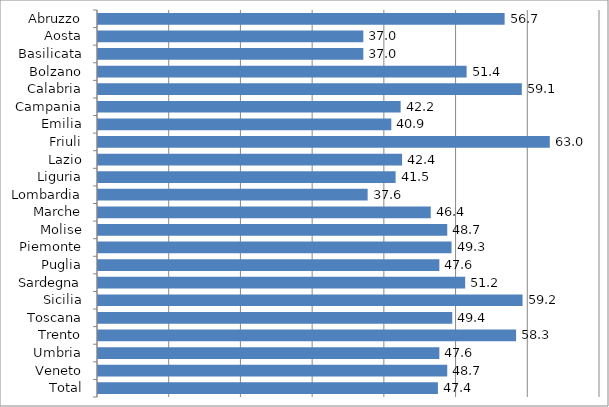
| Category | Series 0 |
|---|---|
| Abruzzo | 56.7 |
| Aosta | 37 |
| Basilicata | 37 |
| Bolzano | 51.4 |
| Calabria | 59.1 |
| Campania | 42.2 |
| Emilia | 40.9 |
| Friuli | 63 |
| Lazio | 42.4 |
| Liguria | 41.5 |
| Lombardia | 37.6 |
| Marche | 46.4 |
| Molise | 48.7 |
| Piemonte | 49.3 |
| Puglia | 47.6 |
| Sardegna | 51.2 |
| Sicilia | 59.2 |
| Toscana | 49.4 |
| Trento | 58.3 |
| Umbria | 47.6 |
| Veneto | 48.7 |
| Total | 47.4 |